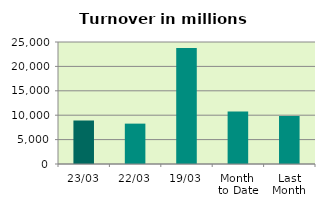
| Category | Series 0 |
|---|---|
| 23/03 | 8906.817 |
| 22/03 | 8272.463 |
| 19/03 | 23771.141 |
| Month 
to Date | 10743.834 |
| Last
Month | 9824.278 |